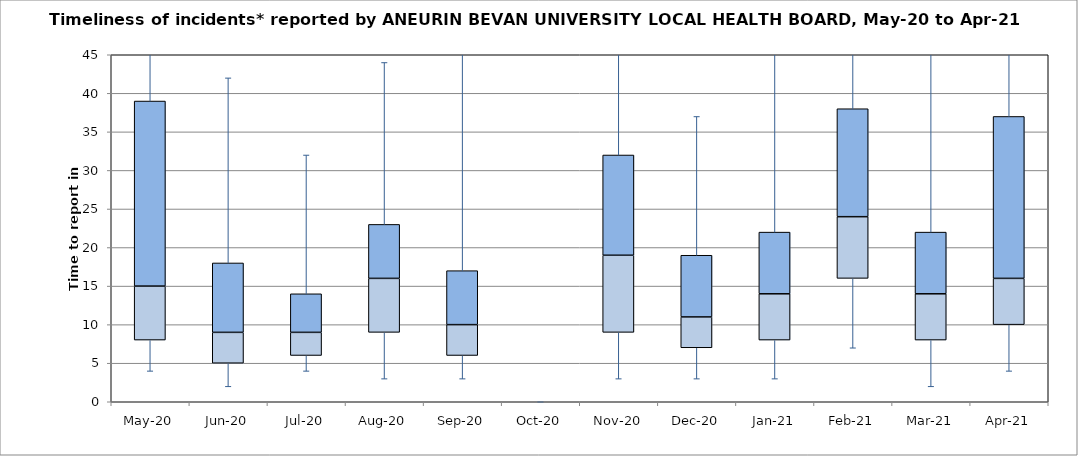
| Category | Series 0 | Series 1 | Series 2 |
|---|---|---|---|
| May-20 | 8 | 7 | 24 |
| Jun-20 | 5 | 4 | 9 |
| Jul-20 | 6 | 3 | 5 |
| Aug-20 | 9 | 7 | 7 |
| Sep-20 | 6 | 4 | 7 |
| Oct-20 | 0 | 0 | 0 |
| Nov-20 | 9 | 10 | 13 |
| Dec-20 | 7 | 4 | 8 |
| Jan-21 | 8 | 6 | 8 |
| Feb-21 | 16 | 8 | 14 |
| Mar-21 | 8 | 6 | 8 |
| Apr-21 | 10 | 6 | 21 |